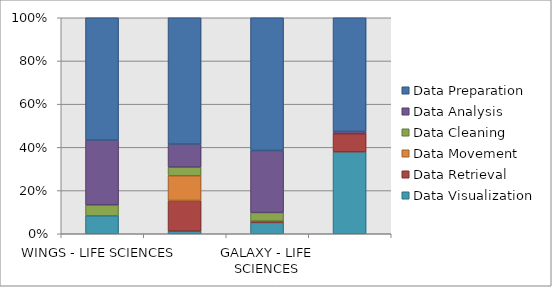
| Category | Data Visualization | Data Retrieval | Data Movement | Data Cleaning | Data Analysis | Data Preparation |
|---|---|---|---|---|---|---|
| WINGS - LIFE SCIENCES | 15 | 0 | 0 | 9 | 54 | 102 |
| TAVERNA - LIFE SCIENCES | 6 | 71 | 57 | 20 | 53 | 292 |
| GALAXY - LIFE SCIENCES | 8 | 1 | 0 | 6 | 44 | 94 |
| VISTRAILS - LIFE SCIENCES | 36 | 8 | 0 | 0 | 1 | 50 |